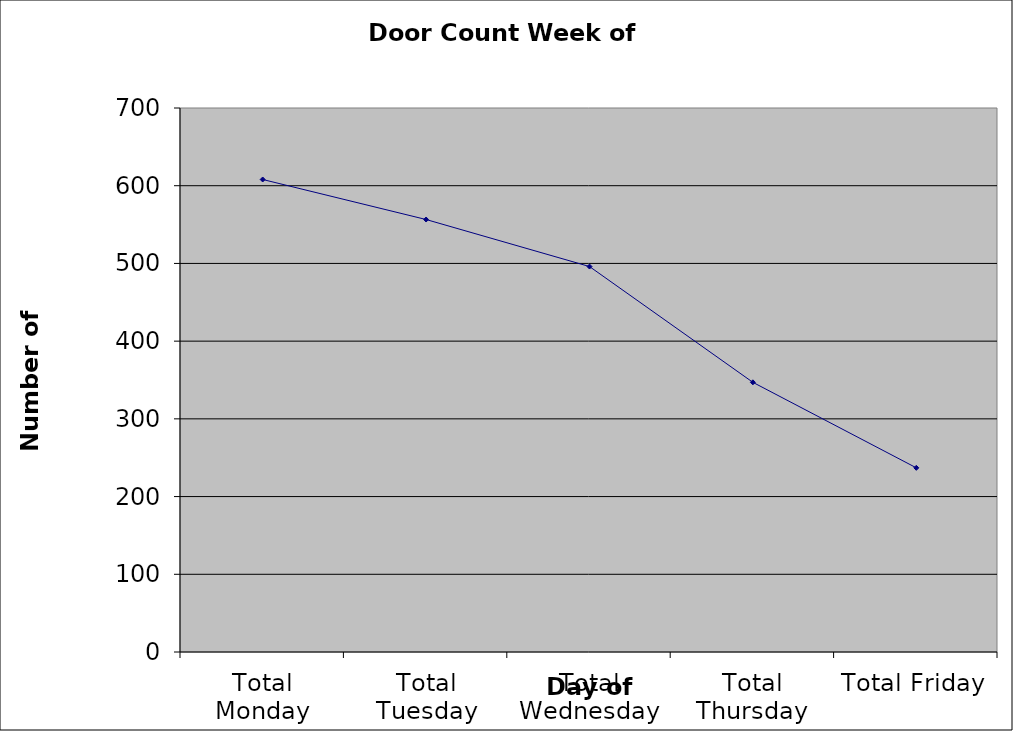
| Category | Series 0 |
|---|---|
| Total Monday | 608 |
| Total Tuesday | 556.5 |
| Total Wednesday | 496 |
| Total Thursday | 347 |
| Total Friday | 237 |